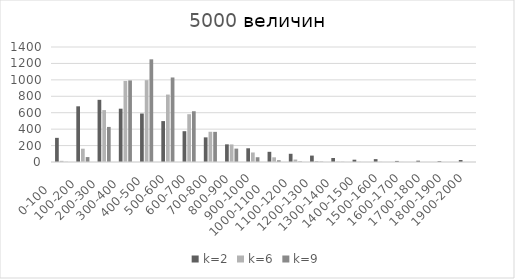
| Category | k=2 | k=6 | k=9 |
|---|---|---|---|
| 0-100     | 294 | 14 | 2 |
| 100-200   | 678 | 162 | 60 |
| 200-300   | 757 | 632 | 427 |
| 300-400   | 649 | 987 | 993 |
| 400-500  | 590 | 996 | 1250 |
| 500-600 | 498 | 821 | 1029 |
| 600-700 | 375 | 582 | 618 |
| 700-800 | 300 | 368 | 367 |
| 800-900 | 215 | 214 | 163 |
| 900-1000 | 167 | 116 | 58 |
| 1000-1100     | 124 | 57 | 21 |
| 1100-1200   | 100 | 30 | 6 |
| 1200-1300   | 78 | 12 | 4 |
| 1300-1400   | 49 | 4 | 2 |
| 1400-1500  | 28 | 2 | 0 |
| 1500-1600 | 35 | 2 | 0 |
| 1600-1700 | 13 | 1 | 0 |
| 1700-1800 | 16 | 0 | 0 |
| 1800-1900 | 10 | 0 | 0 |
| 1900-2000 | 24 | 0 | 0 |